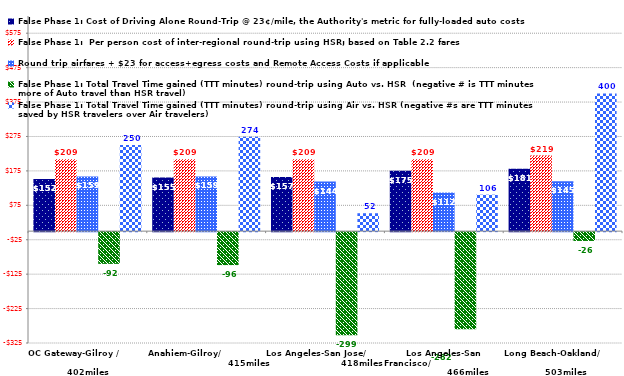
| Category | False Phase 1: Cost of Driving Alone Round-Trip @ 23¢/mile, the Authority's metric for fully-loaded auto costs | False Phase 1:  Per person cost of inter-regional round-trip using HSR; based on Table 2.2 fares | Round trip airfares + $23 for access+egress costs and Remote Access Costs if applicable | False Phase 1: Total Travel Time gained (TTT minutes) round-trip using Auto vs. HSR  (negative # is TTT minutes more of Auto travel than HSR travel) | False Phase 1: Total Travel Time gained (TTT minutes) round-trip using Air vs. HSR (negative #s are TTT minutes saved by HSR travelers over Air travelers) |
|---|---|---|---|---|---|
| OC Gateway-Gilroy /                                                     402miles | 151.8 | 209 | 159 | -92.2 | 250 |
| Anahiem-Gilroy/                                           415miles | 155.48 | 209 | 159 | -95.8 | 274 |
| Los Angeles-San Jose/                              418miles | 157.32 | 209 | 144 | -299.4 | 52 |
| Los Angeles-San Francisco/                                          466miles | 175.26 | 209 | 112 | -282.4 | 106 |
| Long Beach-Oakland/                                                      503miles | 181.24 | 219.4 | 145 | -25.6 | 400 |